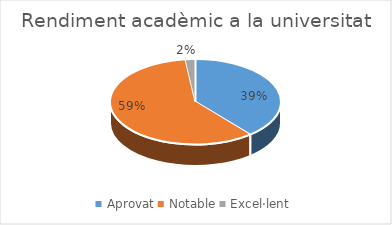
| Category | Series 0 |
|---|---|
| Aprovat | 83 |
| Notable | 126 |
| Excel·lent | 4 |